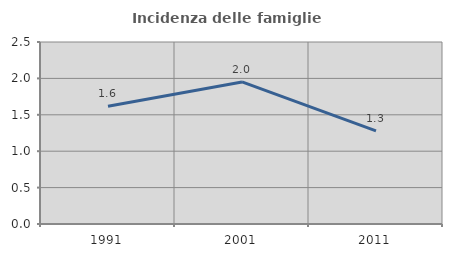
| Category | Incidenza delle famiglie numerose |
|---|---|
| 1991.0 | 1.618 |
| 2001.0 | 1.951 |
| 2011.0 | 1.28 |